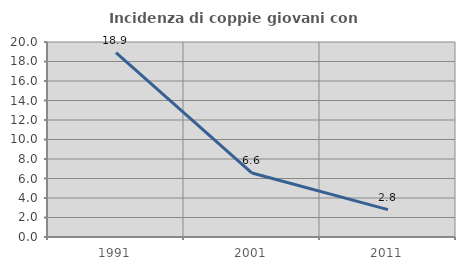
| Category | Incidenza di coppie giovani con figli |
|---|---|
| 1991.0 | 18.898 |
| 2001.0 | 6.557 |
| 2011.0 | 2.804 |